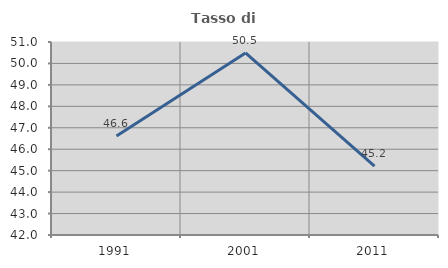
| Category | Tasso di occupazione   |
|---|---|
| 1991.0 | 46.613 |
| 2001.0 | 50.492 |
| 2011.0 | 45.211 |